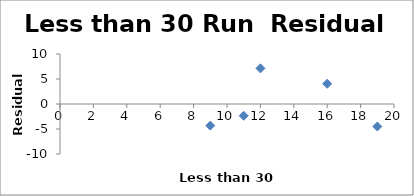
| Category | Series 0 |
|---|---|
| 12.0 | 7.126 |
| 16.0 | 4.052 |
| 9.0 | -4.319 |
| 11.0 | -2.356 |
| 19.0 | -4.503 |